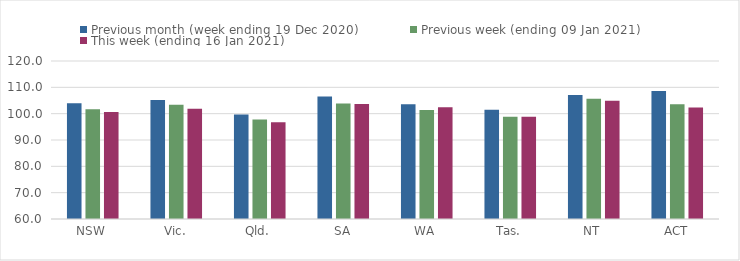
| Category | Previous month (week ending 19 Dec 2020) | Previous week (ending 09 Jan 2021) | This week (ending 16 Jan 2021) |
|---|---|---|---|
| NSW | 104 | 101.64 | 100.6 |
| Vic. | 105.22 | 103.38 | 101.88 |
| Qld. | 99.68 | 97.76 | 96.76 |
| SA | 106.53 | 103.86 | 103.69 |
| WA | 103.59 | 101.43 | 102.44 |
| Tas. | 101.47 | 98.79 | 98.79 |
| NT | 107.11 | 105.69 | 104.92 |
| ACT | 108.61 | 103.6 | 102.33 |